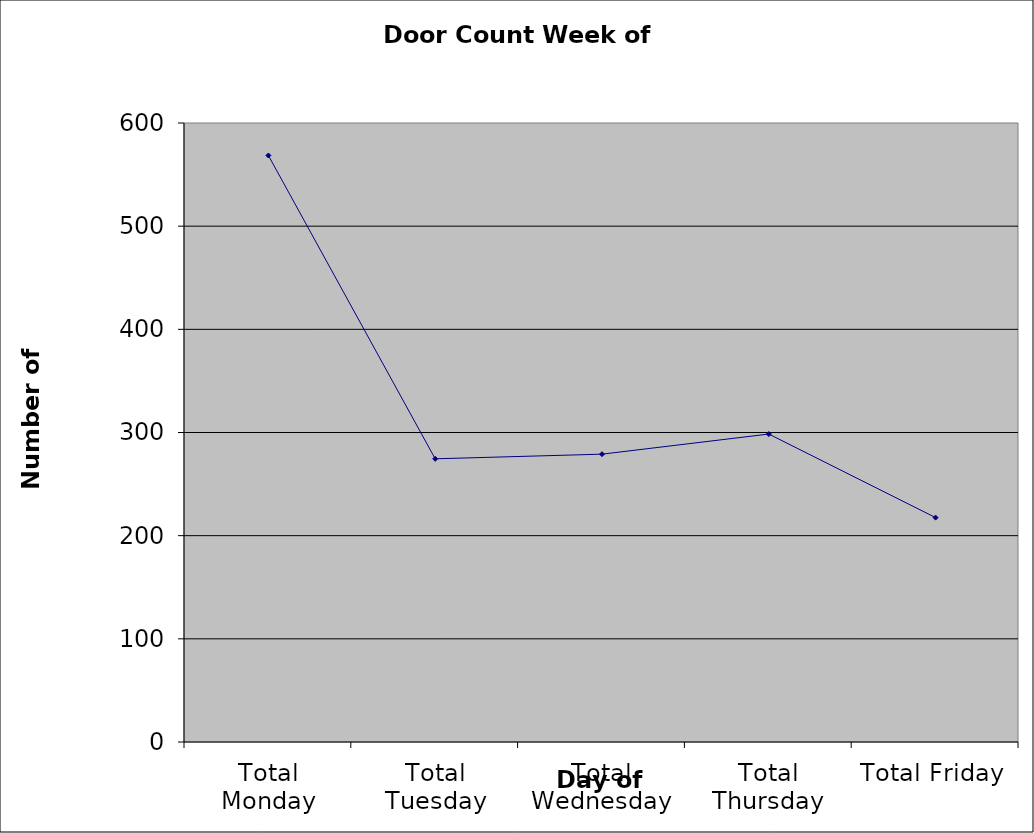
| Category | Series 0 |
|---|---|
| Total Monday | 568.5 |
| Total Tuesday | 274.5 |
| Total Wednesday | 279 |
| Total Thursday | 298.5 |
| Total Friday | 217.5 |